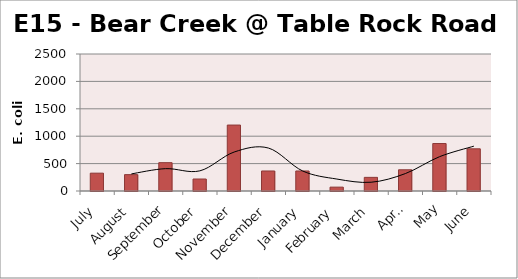
| Category | E. coli MPN |
|---|---|
| July | 325.5 |
| August | 298.7 |
| September | 517.2 |
| October | 218.7 |
| November | 1203.3 |
| December | 365.4 |
| January | 365.4 |
| February | 70.6 |
| March | 248.9 |
| April | 387.3 |
| May | 866.4 |
| June | 770.1 |